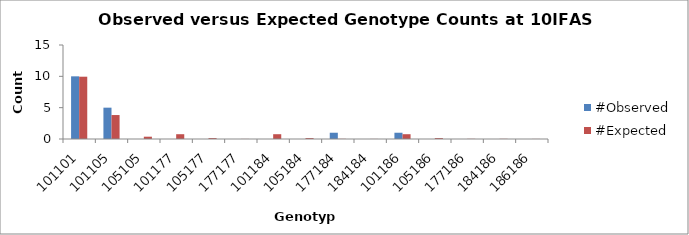
| Category | #Observed | #Expected |
|---|---|---|
| 101101.0 | 10 | 9.941 |
| 101105.0 | 5 | 3.824 |
| 105105.0 | 0 | 0.368 |
| 101177.0 | 0 | 0.765 |
| 105177.0 | 0 | 0.147 |
| 177177.0 | 0 | 0.015 |
| 101184.0 | 0 | 0.765 |
| 105184.0 | 0 | 0.147 |
| 177184.0 | 1 | 0.029 |
| 184184.0 | 0 | 0.015 |
| 101186.0 | 1 | 0.765 |
| 105186.0 | 0 | 0.147 |
| 177186.0 | 0 | 0.029 |
| 184186.0 | 0 | 0.029 |
| 186186.0 | 0 | 0.015 |